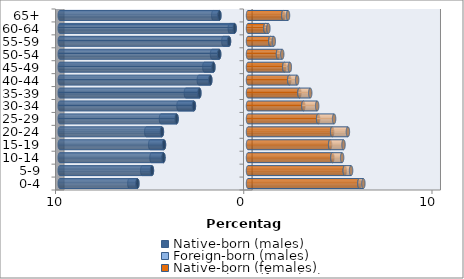
| Category | Native-born (males) | Foreign-born (males) | Native-born (females) | Foreign-born (females) |
|---|---|---|---|---|
| 0-4 | -5.877 | -0.426 | 5.917 | 0.211 |
| 5-9 | -5.103 | -0.515 | 5.14 | 0.336 |
| 10-14 | -4.492 | -0.634 | 4.482 | 0.519 |
| 15-19 | -4.463 | -0.734 | 4.363 | 0.71 |
| 20-24 | -4.573 | -0.833 | 4.47 | 0.837 |
| 25-29 | -3.795 | -0.828 | 3.726 | 0.848 |
| 30-34 | -2.873 | -0.819 | 2.94 | 0.733 |
| 35-39 | -2.583 | -0.717 | 2.732 | 0.573 |
| 40-44 | -2.003 | -0.609 | 2.193 | 0.417 |
| 45-49 | -1.839 | -0.481 | 1.929 | 0.294 |
| 50-54 | -1.532 | -0.379 | 1.593 | 0.225 |
| 55-59 | -1.009 | -0.301 | 1.186 | 0.184 |
| 60-64 | -0.712 | -0.255 | 0.927 | 0.157 |
| 65+ | -1.521 | -0.325 | 1.876 | 0.25 |